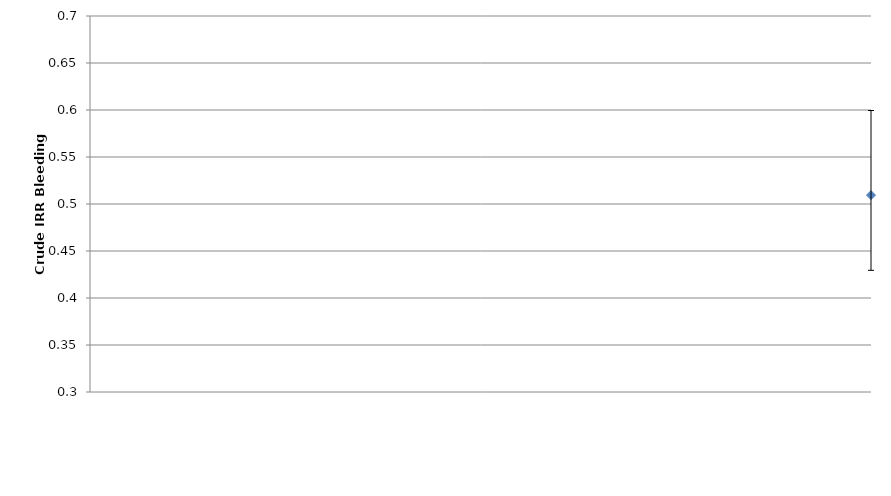
| Category | Series 0 |
|---|---|
| 0 | 0.509 |
| 1 | 0.454 |
| 2 | 0.485 |
| 3 | 0.485 |
| 4 | 0.428 |
| 5 | 0.46 |
| 6 | 0.502 |
| 7 | 0.501 |
| 8 | 0.495 |
| 9 | 0.503 |
| 10 | 0.455 |
| 11 | 0.479 |